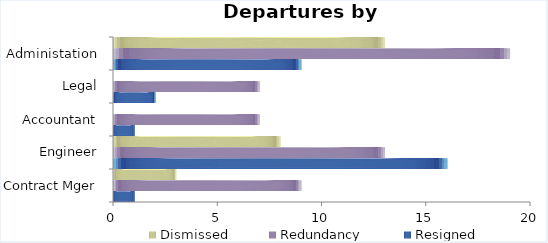
| Category | Resigned | Redundancy | Dismissed |
|---|---|---|---|
| Contract Mger | 1 | 9 | 3 |
| Engineer | 16 | 13 | 8 |
| Accountant | 1 | 7 | 0 |
| Legal | 2 | 7 | 0 |
| Administation | 9 | 19 | 13 |